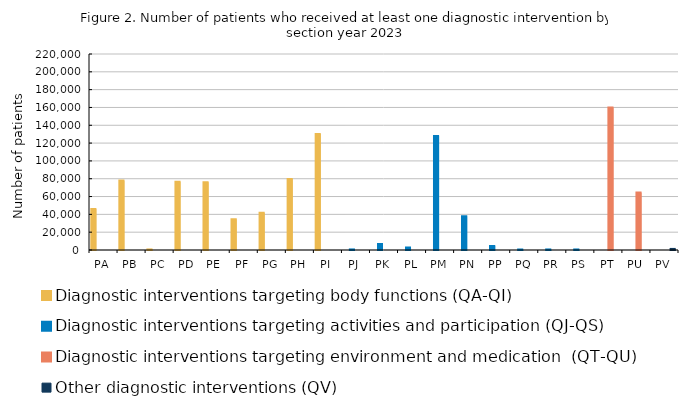
| Category | Diagnostic interventions targeting body functions (QA-QI) | Diagnostic interventions targeting activities and participation (QJ-QS) | Diagnostic interventions targeting environment and medication  (QT-QU) | Other diagnostic interventions (QV) |
|---|---|---|---|---|
| PA | 45932 | 0 | 0 | 0 |
| PB | 77903 | 0 | 0 | 0 |
| PC | 634 | 0 | 0 | 0 |
| PD | 76686 | 0 | 0 | 0 |
| PE | 76117 | 0 | 0 | 0 |
| PF | 34381 | 0 | 0 | 0 |
| PG | 41721 | 0 | 0 | 0 |
| PH | 79708 | 0 | 0 | 0 |
| PI | 130321 | 0 | 0 | 0 |
| PJ | 0 | 627 | 0 | 0 |
| PK | 0 | 6801 | 0 | 0 |
| PL | 0 | 2795 | 0 | 0 |
| PM | 0 | 127933 | 0 | 0 |
| PN | 0 | 37807 | 0 | 0 |
| PP | 0 | 4495 | 0 | 0 |
| PQ | 0 | 558 | 0 | 0 |
| PR | 0 | 626 | 0 | 0 |
| PS | 0 | 615 | 0 | 0 |
| PT | 0 | 0 | 160025 | 0 |
| PU | 0 | 0 | 64429 | 0 |
| PV | 0 | 0 | 0 | 1202 |